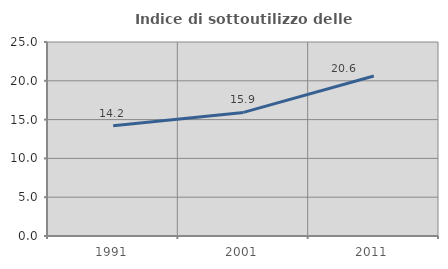
| Category | Indice di sottoutilizzo delle abitazioni  |
|---|---|
| 1991.0 | 14.203 |
| 2001.0 | 15.929 |
| 2011.0 | 20.619 |